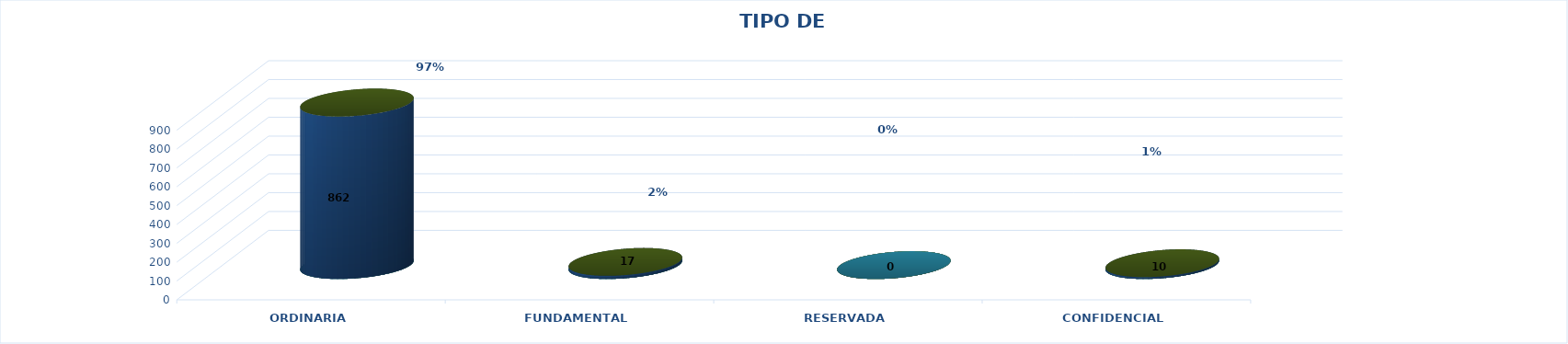
| Category | Series 0 | Series 2 | Series 1 | Series 3 | Series 4 |
|---|---|---|---|---|---|
| ORDINARIA |  |  |  | 862 | 0.97 |
| FUNDAMENTAL |  |  |  | 17 | 0.019 |
| RESERVADA |  |  |  | 0 | 0 |
| CONFIDENCIAL |  |  |  | 10 | 0.011 |